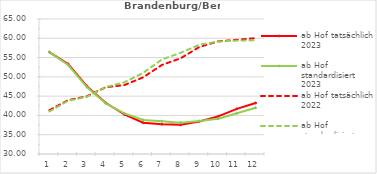
| Category | ab Hof tatsächlich 2023 | ab Hof standardisiert 2023 | ab Hof tatsächlich 2022 | ab Hof standardisiert 2022 |
|---|---|---|---|---|
| 0 | 56.412 | 56.417 | 41.36 | 41.025 |
| 1 | 53.355 | 53.073 | 43.957 | 43.803 |
| 2 | 47.596 | 47.363 | 44.954 | 44.821 |
| 3 | 43.283 | 43.125 | 47.309 | 47.351 |
| 4 | 40.247 | 40.518 | 47.866 | 48.568 |
| 5 | 38.098 | 38.823 | 49.872 | 51.026 |
| 6 | 37.73 | 38.52 | 53.084 | 54.496 |
| 7 | 37.558 | 38.131 | 54.815 | 56.246 |
| 8 | 38.438 | 38.563 | 57.746 | 58.328 |
| 9 | 39.743 | 39.127 | 59.204 | 59.153 |
| 10 | 41.713 | 40.566 | 59.608 | 59.397 |
| 11 | 43.233 | 41.992 | 60.03 | 59.479 |